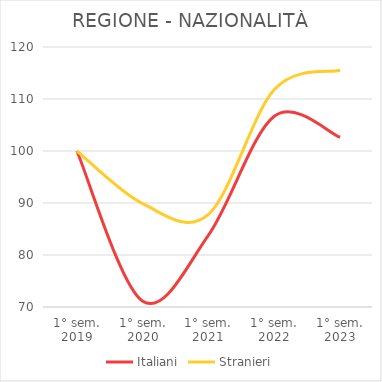
| Category | Italiani | Stranieri |
|---|---|---|
| 1° sem.
2019 | 100 | 100 |
| 1° sem.
2020 | 71.115 | 89.871 |
| 1° sem.
2021 | 83.837 | 87.808 |
| 1° sem.
2022 | 106.681 | 111.807 |
| 1° sem.
2023 | 102.64 | 115.53 |